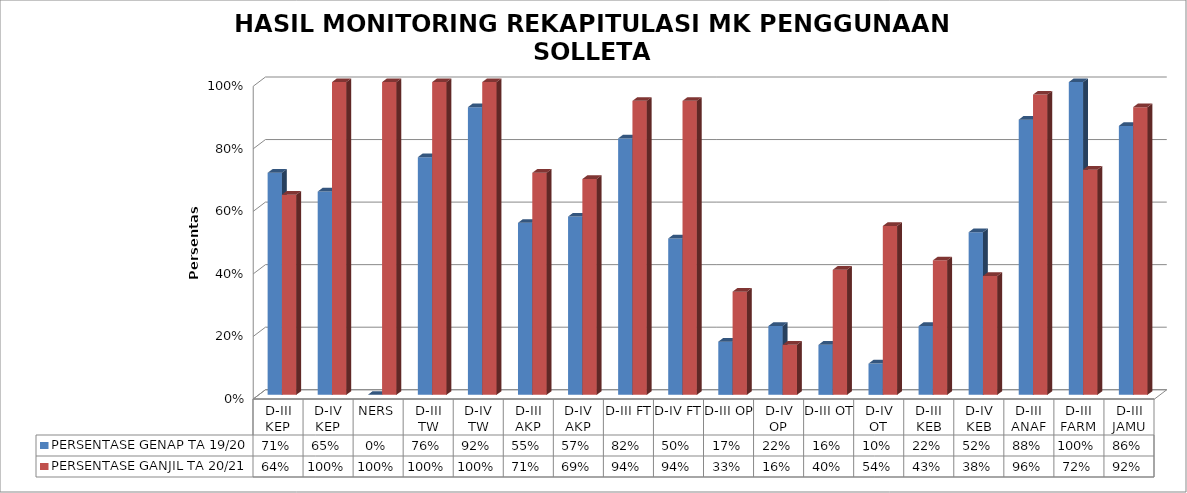
| Category | PERSENTASE GENAP TA 19/20 | PERSENTASE GANJIL TA 20/21 |
|---|---|---|
| D-III KEP | 0.71 | 0.64 |
| D-IV KEP | 0.65 | 1 |
| NERS | 0 | 1 |
| D-III TW | 0.76 | 1 |
| D-IV TW | 0.92 | 1 |
| D-III AKP | 0.55 | 0.71 |
| D-IV AKP | 0.57 | 0.69 |
| D-III FT | 0.82 | 0.94 |
| D-IV FT | 0.5 | 0.94 |
| D-III OP | 0.17 | 0.33 |
| D-IV OP | 0.22 | 0.16 |
| D-III OT | 0.16 | 0.4 |
| D-IV OT | 0.1 | 0.54 |
| D-III KEB | 0.22 | 0.43 |
| D-IV KEB | 0.52 | 0.38 |
| D-III ANAF | 0.88 | 0.96 |
| D-III FARM | 1 | 0.72 |
| D-III JAMU | 0.86 | 0.92 |